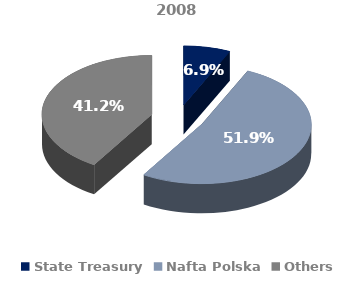
| Category | 2008 |
|---|---|
| State Treasury | 0.069 |
| Nafta Polska | 0.519 |
| Others | 0.412 |